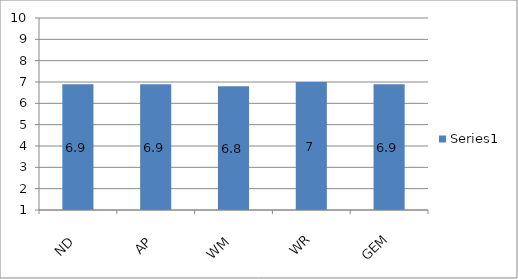
| Category | Series 0 |
|---|---|
| ND | 6.9 |
| AP | 6.9 |
| WM | 6.8 |
| WR | 7 |
| GEM | 6.9 |